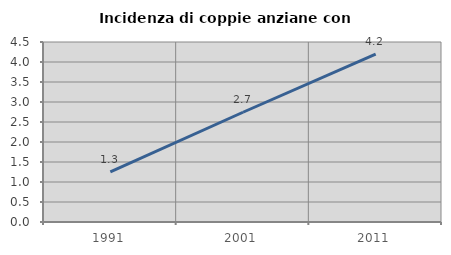
| Category | Incidenza di coppie anziane con figli |
|---|---|
| 1991.0 | 1.256 |
| 2001.0 | 2.744 |
| 2011.0 | 4.197 |